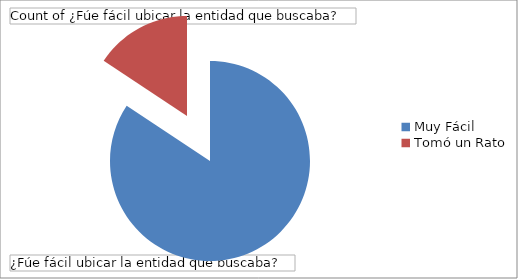
| Category | Total |
|---|---|
| Muy Fácil | 156 |
| Tomó un Rato | 29 |